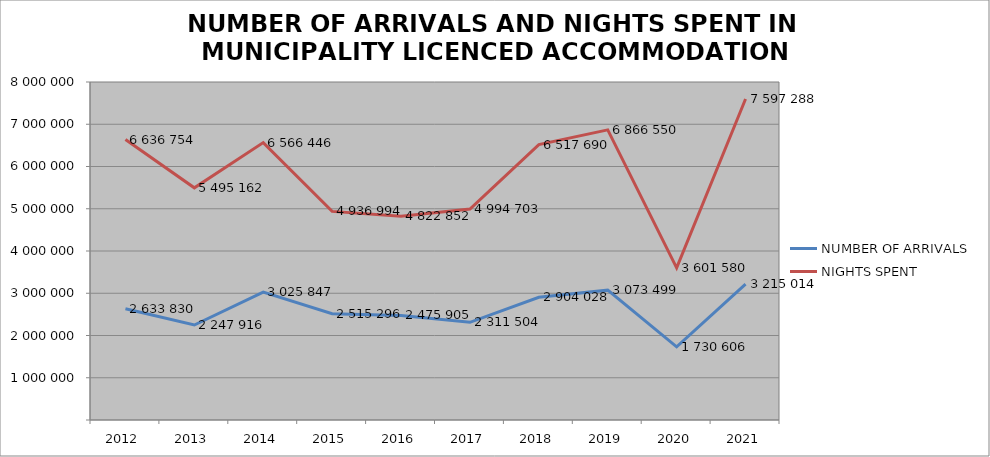
| Category | NUMBER OF ARRIVALS | NIGHTS SPENT |
|---|---|---|
| 2012 | 2633830 | 6636754 |
| 2013 | 2247916 | 5495162 |
| 2014 | 3025847 | 6566446 |
| 2015 | 2515296 | 4936994 |
| 2016 | 2475905 | 4822852 |
| 2017 | 2311504 | 4994703 |
| 2018 | 2904028 | 6517690 |
| 2019 | 3073499 | 6866550 |
| 2020 | 1730606 | 3601580 |
| 2021 | 3215014 | 7597288 |